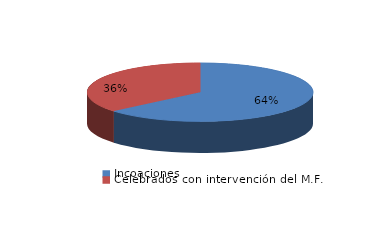
| Category | Series 0 |
|---|---|
| Incoaciones | 1891 |
| Celebrados con intervención del M.F. | 1074 |